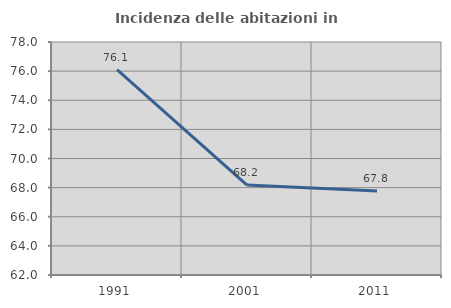
| Category | Incidenza delle abitazioni in proprietà  |
|---|---|
| 1991.0 | 76.104 |
| 2001.0 | 68.177 |
| 2011.0 | 67.77 |